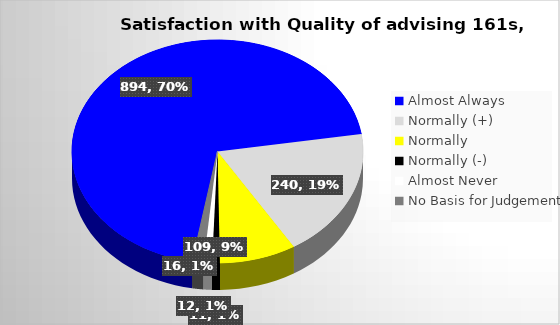
| Category | Series 0 |
|---|---|
| Almost Always | 894 |
| Normally (+) | 240 |
| Normally  | 109 |
| Normally (-) | 11 |
| Almost Never | 12 |
| No Basis for Judgement | 16 |